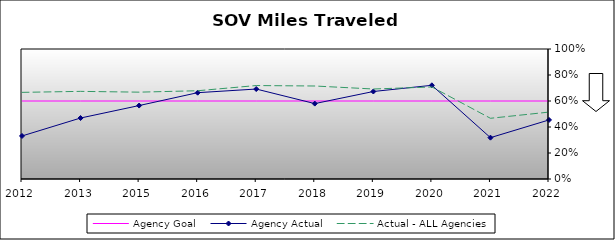
| Category | Agency Goal | Agency Actual | Actual - ALL Agencies |
|---|---|---|---|
| 2012.0 | 0.6 | 0.331 | 0.666 |
| 2013.0 | 0.6 | 0.469 | 0.674 |
| 2015.0 | 0.6 | 0.565 | 0.668 |
| 2016.0 | 0.6 | 0.664 | 0.679 |
| 2017.0 | 0.6 | 0.692 | 0.719 |
| 2018.0 | 0.6 | 0.58 | 0.715 |
| 2019.0 | 0.6 | 0.673 | 0.692 |
| 2020.0 | 0.6 | 0.721 | 0.708 |
| 2021.0 | 0.6 | 0.318 | 0.467 |
| 2022.0 | 0.6 | 0.454 | 0.515 |